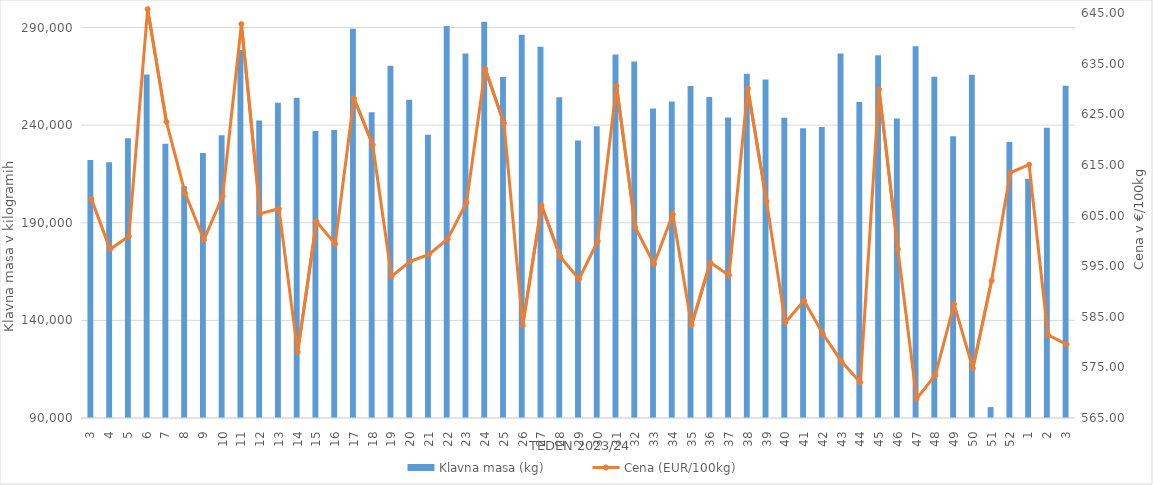
| Category | Klavna masa (kg) |
|---|---|
| 3.0 | 222198 |
| 4.0 | 221002 |
| 5.0 | 233306 |
| 6.0 | 265944 |
| 7.0 | 230531 |
| 8.0 | 208699 |
| 9.0 | 225712 |
| 10.0 | 234762 |
| 11.0 | 278467 |
| 12.0 | 242369 |
| 13.0 | 251507 |
| 14.0 | 254072 |
| 15.0 | 236964 |
| 16.0 | 237552 |
| 17.0 | 289400 |
| 18.0 | 246616 |
| 19.0 | 270374 |
| 20.0 | 252984 |
| 21.0 | 235060 |
| 22.0 | 290816 |
| 23.0 | 276702 |
| 24.0 | 292976 |
| 25.0 | 264669 |
| 26.0 | 286237 |
| 27.0 | 280112 |
| 28.0 | 254336 |
| 29.0 | 232178 |
| 30.0 | 239437 |
| 31.0 | 276163 |
| 32.0 | 272647 |
| 33.0 | 248536 |
| 34.0 | 252050 |
| 35.0 | 260110 |
| 36.0 | 254389 |
| 37.0 | 243933 |
| 38.0 | 266321 |
| 39.0 | 263346 |
| 40.0 | 243765 |
| 41.0 | 238404 |
| 42.0 | 239007 |
| 43.0 | 276684 |
| 44.0 | 251832 |
| 45.0 | 275816 |
| 46.0 | 243425 |
| 47.0 | 280350 |
| 48.0 | 264849 |
| 49.0 | 234308 |
| 50.0 | 265786 |
| 51.0 | 95590 |
| 52.0 | 231370 |
| 1.0 | 212581 |
| 2.0 | 238607 |
| 3.0 | 260140 |